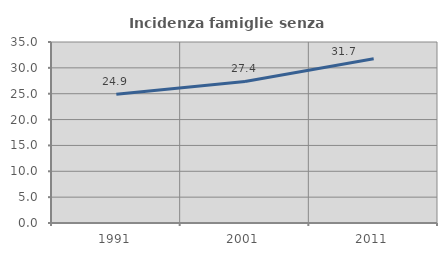
| Category | Incidenza famiglie senza nuclei |
|---|---|
| 1991.0 | 24.881 |
| 2001.0 | 27.366 |
| 2011.0 | 31.75 |